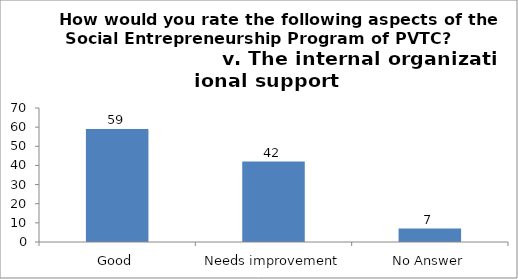
| Category | How would you rate the following aspects of the Social Entrepreneurship program of PVTC? v. The internal organizational support  |
|---|---|
| Good | 59 |
| Needs improvement | 42 |
| No Answer | 7 |